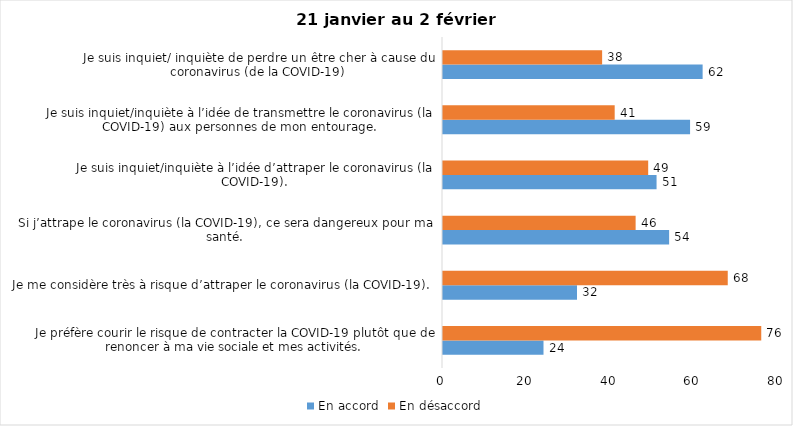
| Category | En accord | En désaccord |
|---|---|---|
| Je préfère courir le risque de contracter la COVID-19 plutôt que de renoncer à ma vie sociale et mes activités. | 24 | 76 |
| Je me considère très à risque d’attraper le coronavirus (la COVID-19). | 32 | 68 |
| Si j’attrape le coronavirus (la COVID-19), ce sera dangereux pour ma santé. | 54 | 46 |
| Je suis inquiet/inquiète à l’idée d’attraper le coronavirus (la COVID-19). | 51 | 49 |
| Je suis inquiet/inquiète à l’idée de transmettre le coronavirus (la COVID-19) aux personnes de mon entourage. | 59 | 41 |
| Je suis inquiet/ inquiète de perdre un être cher à cause du coronavirus (de la COVID-19) | 62 | 38 |